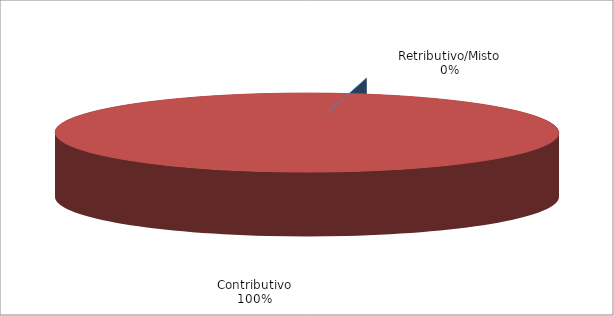
| Category | Series 1 |
|---|---|
| Retributivo/Misto | 0 |
| Contributivo | 35230 |